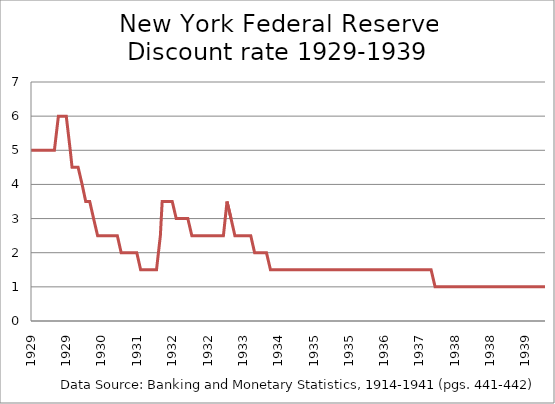
| Category | Series 0 |
|---|---|
| 1929-01-01 | 5 |
| 1929-02-01 | 5 |
| 1929-03-01 | 5 |
| 1929-04-01 | 5 |
| 1929-05-01 | 5 |
| 1929-06-01 | 5 |
| 1929-07-01 | 5 |
| 1929-08-01 | 6 |
| 1929-09-01 | 6 |
| 1929-10-01 | 6 |
| 1929-11-01 | 5 |
| 1929-11-15 | 4.5 |
| 1929-12-01 | 4.5 |
| 1930-01-01 | 4.5 |
| 1930-02-01 | 4 |
| 1930-03-01 | 3.5 |
| 1930-04-01 | 3.5 |
| 1930-05-01 | 3 |
| 1930-06-01 | 2.5 |
| 1930-07-01 | 2.5 |
| 1930-08-01 | 2.5 |
| 1930-09-01 | 2.5 |
| 1930-10-01 | 2.5 |
| 1930-11-01 | 2.5 |
| 1930-12-01 | 2 |
| 1931-01-01 | 2 |
| 1931-02-01 | 2 |
| 1931-03-01 | 2 |
| 1931-04-01 | 2 |
| 1931-05-01 | 1.5 |
| 1931-06-01 | 1.5 |
| 1931-07-01 | 1.5 |
| 1931-08-01 | 1.5 |
| 1931-09-01 | 1.5 |
| 1931-10-01 | 2.5 |
| 1931-10-15 | 3.5 |
| 1931-11-01 | 3.5 |
| 1931-12-01 | 3.5 |
| 1932-01-01 | 3.5 |
| 1932-02-01 | 3 |
| 1932-03-01 | 3 |
| 1932-04-01 | 3 |
| 1932-05-01 | 3 |
| 1932-06-01 | 2.5 |
| 1932-07-01 | 2.5 |
| 1932-08-01 | 2.5 |
| 1932-09-01 | 2.5 |
| 1932-10-01 | 2.5 |
| 1932-11-01 | 2.5 |
| 1932-12-01 | 2.5 |
| 1933-01-01 | 2.5 |
| 1933-02-01 | 2.5 |
| 1933-03-01 | 3.5 |
| 1933-04-01 | 3 |
| 1933-05-01 | 2.5 |
| 1933-06-01 | 2.5 |
| 1933-07-01 | 2.5 |
| 1933-08-01 | 2.5 |
| 1933-09-01 | 2.5 |
| 1933-10-01 | 2 |
| 1933-11-01 | 2 |
| 1933-12-01 | 2 |
| 1934-01-01 | 2 |
| 1934-02-01 | 1.5 |
| 1934-03-01 | 1.5 |
| 1934-04-01 | 1.5 |
| 1934-05-01 | 1.5 |
| 1934-06-01 | 1.5 |
| 1934-07-01 | 1.5 |
| 1934-08-01 | 1.5 |
| 1934-09-01 | 1.5 |
| 1934-10-01 | 1.5 |
| 1934-11-01 | 1.5 |
| 1934-12-01 | 1.5 |
| 1935-01-01 | 1.5 |
| 1935-02-01 | 1.5 |
| 1935-03-01 | 1.5 |
| 1935-04-01 | 1.5 |
| 1935-05-01 | 1.5 |
| 1935-06-01 | 1.5 |
| 1935-07-01 | 1.5 |
| 1935-08-01 | 1.5 |
| 1935-09-01 | 1.5 |
| 1935-10-01 | 1.5 |
| 1935-11-01 | 1.5 |
| 1935-12-01 | 1.5 |
| 1936-01-01 | 1.5 |
| 1936-02-01 | 1.5 |
| 1936-03-01 | 1.5 |
| 1936-04-01 | 1.5 |
| 1936-05-01 | 1.5 |
| 1936-06-01 | 1.5 |
| 1936-07-01 | 1.5 |
| 1936-08-01 | 1.5 |
| 1936-09-01 | 1.5 |
| 1936-10-01 | 1.5 |
| 1936-11-01 | 1.5 |
| 1936-12-01 | 1.5 |
| 1937-01-01 | 1.5 |
| 1937-02-01 | 1.5 |
| 1937-03-01 | 1.5 |
| 1937-04-01 | 1.5 |
| 1937-05-01 | 1.5 |
| 1937-06-01 | 1.5 |
| 1937-07-01 | 1.5 |
| 1937-08-01 | 1 |
| 1937-09-01 | 1 |
| 1937-10-01 | 1 |
| 1937-11-01 | 1 |
| 1937-12-01 | 1 |
| 1938-01-01 | 1 |
| 1938-02-01 | 1 |
| 1938-03-01 | 1 |
| 1938-04-01 | 1 |
| 1938-05-01 | 1 |
| 1938-06-01 | 1 |
| 1938-07-01 | 1 |
| 1938-08-01 | 1 |
| 1938-09-01 | 1 |
| 1938-10-01 | 1 |
| 1938-11-01 | 1 |
| 1938-12-01 | 1 |
| 1939-01-01 | 1 |
| 1939-02-01 | 1 |
| 1939-03-01 | 1 |
| 1939-04-01 | 1 |
| 1939-05-01 | 1 |
| 1939-06-01 | 1 |
| 1939-07-01 | 1 |
| 1939-08-01 | 1 |
| 1939-09-01 | 1 |
| 1939-10-01 | 1 |
| 1939-11-01 | 1 |
| 1939-12-01 | 1 |